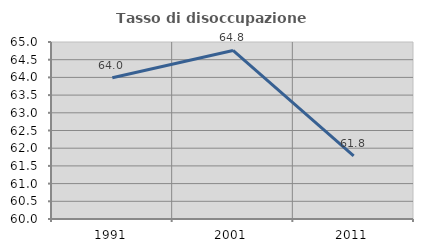
| Category | Tasso di disoccupazione giovanile  |
|---|---|
| 1991.0 | 63.991 |
| 2001.0 | 64.762 |
| 2011.0 | 61.783 |